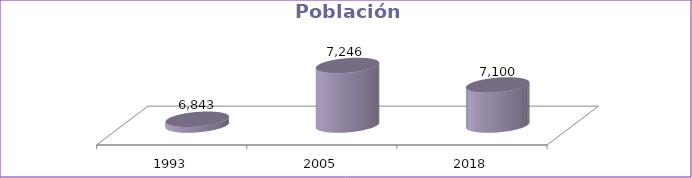
| Category | Población Total |
|---|---|
| 1993 | 6843 |
| 2005 | 7246 |
| 2018 | 7100 |